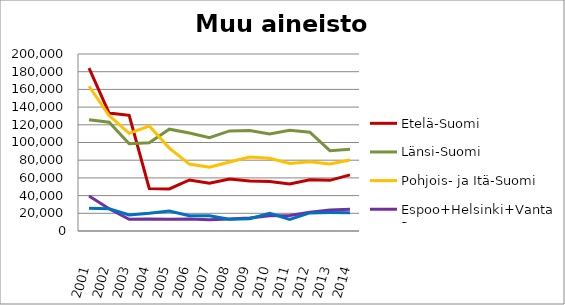
| Category | Etelä-Suomi | Länsi-Suomi | Pohjois- ja Itä-Suomi | Espoo+Helsinki+Vantaa | Muu Uusimaa |
|---|---|---|---|---|---|
| 2001.0 | 184126 | 125820 | 163586 | 39478 | 25814 |
| 2002.0 | 133285 | 122978 | 130381 | 25136 | 25273 |
| 2003.0 | 130694 | 98549 | 110367 | 13213 | 18121 |
| 2004.0 | 47999 | 99650 | 118663 | 13588 | 20013 |
| 2005.0 | 47534 | 115046 | 93696 | 13361 | 22530 |
| 2006.0 | 57654 | 110740 | 75613 | 13477 | 17318 |
| 2007.0 | 53854 | 105525 | 72032 | 12840 | 17251 |
| 2008.0 | 58654 | 113115 | 78042 | 13480 | 13284 |
| 2009.0 | 56551 | 113665 | 83533 | 14657 | 13854 |
| 2010.0 | 56058 | 109497 | 82208 | 17167 | 19914 |
| 2011.0 | 53009 | 113806 | 76261 | 17548 | 13148 |
| 2012.0 | 57862 | 111710 | 78220 | 21189 | 20469 |
| 2013.0 | 57246 | 90782 | 75778 | 23791 | 20823 |
| 2014.0 | 63408 | 92331 | 80248 | 24457 | 20718 |